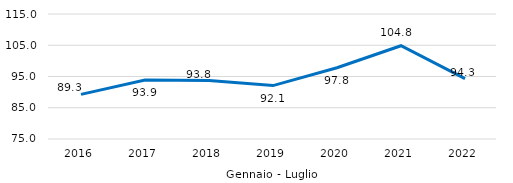
| Category | Series 0 |
|---|---|
| 0 | 89.282 |
| 1 | 93.877 |
| 2 | 93.756 |
| 3 | 92.09 |
| 4 | 97.79 |
| 5 | 104.843 |
| 6 | 94.327 |